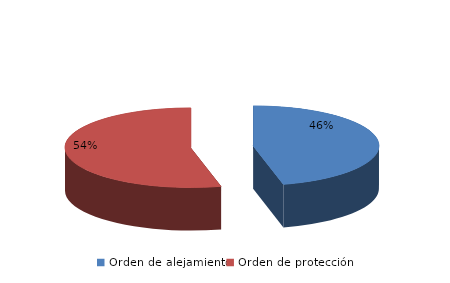
| Category | Series 0 |
|---|---|
| Orden de alejamiento | 143 |
| Orden de protección | 167 |